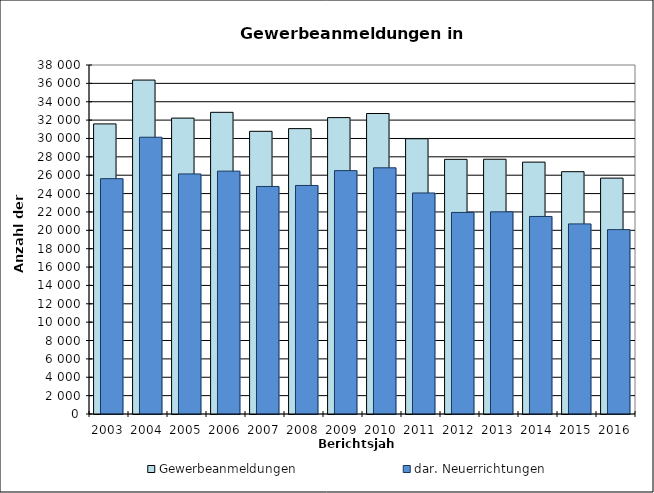
| Category | Gewerbeanmeldungen | dar. Neuerrichtungen |
|---|---|---|
| 2003.0 | 31587 | 25624 |
| 2004.0 | 36359 | 30135 |
| 2005.0 | 32219 | 26140 |
| 2006.0 | 32847 | 26444 |
| 2007.0 | 30781 | 24775 |
| 2008.0 | 31074 | 24884 |
| 2009.0 | 32271 | 26499 |
| 2010.0 | 32718 | 26806 |
| 2011.0 | 29971 | 24066 |
| 2012.0 | 27728 | 21948 |
| 2013.0 | 27739 | 22013 |
| 2014.0 | 27426 | 21509 |
| 2015.0 | 26383 | 20698 |
| 2016.0 | 25683 | 20075 |